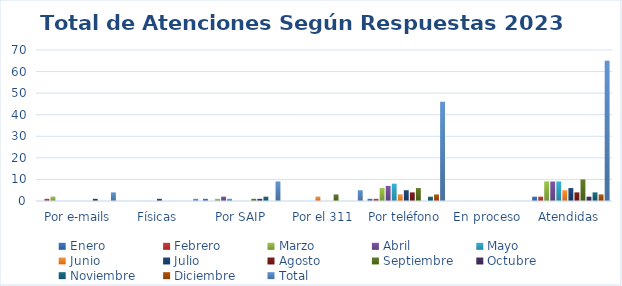
| Category | Enero | Febrero | Marzo | Abril | Mayo | Junio | Julio | Agosto  | Septiembre | Octubre | Noviembre | Diciembre | Total |
|---|---|---|---|---|---|---|---|---|---|---|---|---|---|
|  Por e-mails | 0 | 1 | 2 | 0 | 0 | 0 | 0 | 0 | 0 | 1 | 0 | 0 | 4 |
| Físicas | 0 | 0 | 0 | 0 | 0 | 0 | 1 | 0 | 0 | 0 | 0 | 0 | 1 |
| Por SAIP | 1 | 0 | 1 | 2 | 1 | 0 | 0 | 0 | 1 | 1 | 2 | 0 | 9 |
| Por el 311 | 0 | 0 | 0 | 0 | 0 | 2 | 0 | 0 | 3 | 0 | 0 | 0 | 5 |
| Por teléfono | 1 | 1 | 6 | 7 | 8 | 3 | 5 | 4 | 6 | 0 | 2 | 3 | 46 |
| En proceso | 0 | 0 | 0 | 0 | 0 | 0 | 0 | 0 | 0 | 0 | 0 | 0 | 0 |
| Atendidas | 2 | 2 | 9 | 9 | 9 | 5 | 6 | 4 | 10 | 2 | 4 | 3 | 65 |